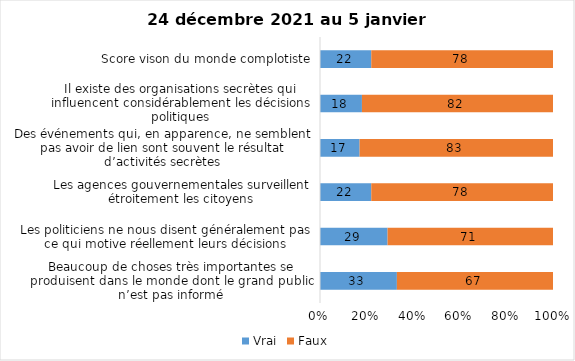
| Category | Vrai | Faux |
|---|---|---|
| Beaucoup de choses très importantes se produisent dans le monde dont le grand public n’est pas informé | 33 | 67 |
| Les politiciens ne nous disent généralement pas ce qui motive réellement leurs décisions | 29 | 71 |
| Les agences gouvernementales surveillent étroitement les citoyens | 22 | 78 |
| Des événements qui, en apparence, ne semblent pas avoir de lien sont souvent le résultat d’activités secrètes | 17 | 83 |
| Il existe des organisations secrètes qui influencent considérablement les décisions politiques | 18 | 82 |
| Score vison du monde complotiste | 22 | 78 |